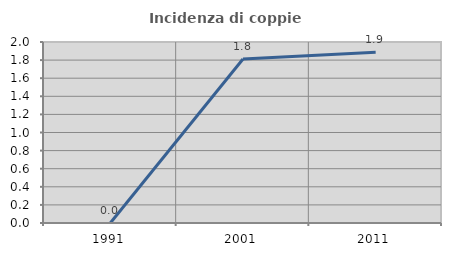
| Category | Incidenza di coppie miste |
|---|---|
| 1991.0 | 0 |
| 2001.0 | 1.812 |
| 2011.0 | 1.887 |